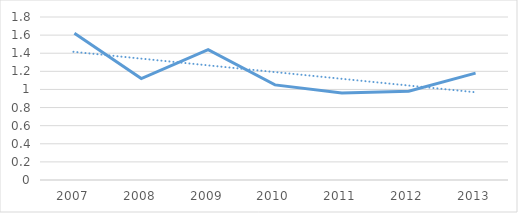
| Category | Series 0 |
|---|---|
| 2007.0 | 1.62 |
| 2008.0 | 1.12 |
| 2009.0 | 1.44 |
| 2010.0 | 1.05 |
| 2011.0 | 0.96 |
| 2012.0 | 0.98 |
| 2013.0 | 1.18 |